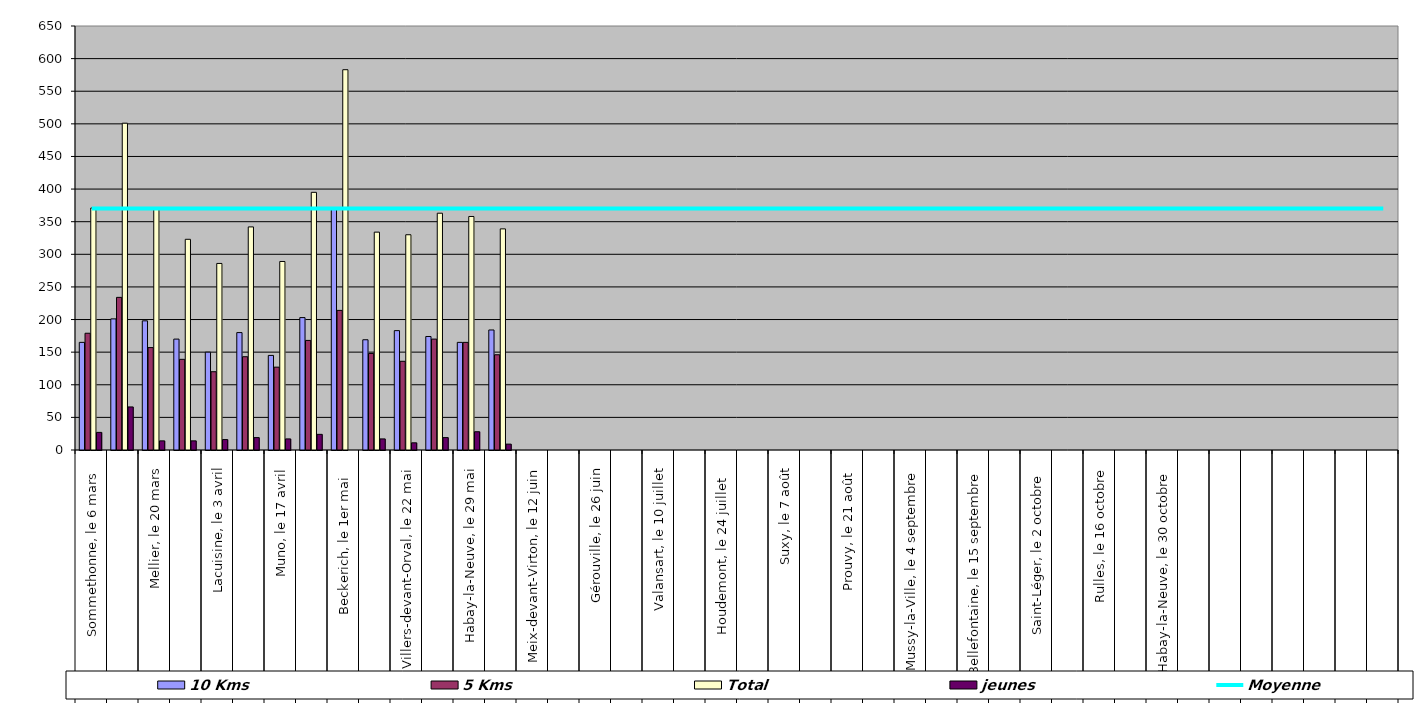
| Category | 10 Kms | 5 Kms | Total | jeunes |
|---|---|---|---|---|
| 0 | 165 | 179 | 371 | 27 |
| 1 | 201 | 234 | 501 | 66 |
| 2 | 198 | 157 | 369 | 14 |
| 3 | 170 | 139 | 323 | 14 |
| 4 | 150 | 120 | 286 | 16 |
| 5 | 180 | 143 | 342 | 19 |
| 6 | 145 | 127 | 289 | 17 |
| 7 | 203 | 168 | 395 | 24 |
| 8 | 369 | 214 | 583 | 0 |
| 9 | 169 | 148 | 334 | 17 |
| 10 | 183 | 136 | 330 | 11 |
| 11 | 174 | 170 | 363 | 19 |
| 12 | 165 | 165 | 358 | 28 |
| 13 | 184 | 146 | 339 | 9 |
| 14 | 0 | 0 | 0 | 0 |
| 15 | 0 | 0 | 0 | 0 |
| 16 | 0 | 0 | 0 | 0 |
| 17 | 0 | 0 | 0 | 0 |
| 18 | 0 | 0 | 0 | 0 |
| 19 | 0 | 0 | 0 | 0 |
| 20 | 0 | 0 | 0 | 0 |
| 21 | 0 | 0 | 0 | 0 |
| 22 | 0 | 0 | 0 | 0 |
| 23 | 0 | 0 | 0 | 0 |
| 24 | 0 | 0 | 0 | 0 |
| 25 | 0 | 0 | 0 | 0 |
| 26 | 0 | 0 | 0 | 0 |
| 27 | 0 | 0 | 0 | 0 |
| 28 | 0 | 0 | 0 | 0 |
| 29 | 0 | 0 | 0 | 0 |
| 30 | 0 | 0 | 0 | 0 |
| 31 | 0 | 0 | 0 | 0 |
| 32 | 0 | 0 | 0 | 0 |
| 33 | 0 | 0 | 0 | 0 |
| 34 | 0 | 0 | 0 | 0 |
| 35 | 0 | 0 | 0 | 0 |
| 36 | 0 | 0 | 0 | 0 |
| 37 | 0 | 0 | 0 | 0 |
| 38 | 0 | 0 | 0 | 0 |
| 39 | 0 | 0 | 0 | 0 |
| 40 | 0 | 0 | 0 | 0 |
| 41 | 0 | 0 | 0 | 0 |